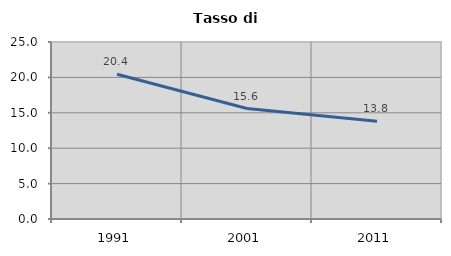
| Category | Tasso di disoccupazione   |
|---|---|
| 1991.0 | 20.435 |
| 2001.0 | 15.604 |
| 2011.0 | 13.796 |